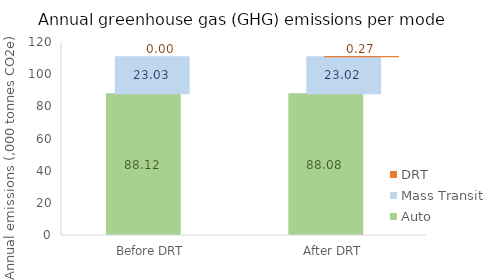
| Category | Auto | Mass Transit | DRT |
|---|---|---|---|
| Before DRT | 88121.647 | 23025.6 | 0 |
| After DRT | 88082.805 | 23015.443 | 267.786 |